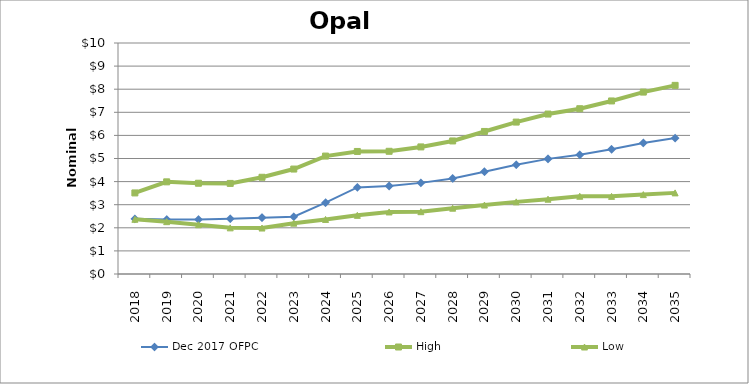
| Category | Dec 2017 OFPC | High | Low |
|---|---|---|---|
| 2018.0 | 2.387 | 3.51 | 2.367 |
| 2019.0 | 2.358 | 3.989 | 2.266 |
| 2020.0 | 2.358 | 3.929 | 2.133 |
| 2021.0 | 2.391 | 3.921 | 1.998 |
| 2022.0 | 2.439 | 4.187 | 1.991 |
| 2023.0 | 2.477 | 4.543 | 2.199 |
| 2024.0 | 3.086 | 5.105 | 2.362 |
| 2025.0 | 3.749 | 5.305 | 2.539 |
| 2026.0 | 3.809 | 5.312 | 2.686 |
| 2027.0 | 3.945 | 5.501 | 2.698 |
| 2028.0 | 4.134 | 5.76 | 2.849 |
| 2029.0 | 4.429 | 6.17 | 2.985 |
| 2030.0 | 4.73 | 6.576 | 3.123 |
| 2031.0 | 4.984 | 6.924 | 3.239 |
| 2032.0 | 5.159 | 7.156 | 3.366 |
| 2033.0 | 5.398 | 7.491 | 3.361 |
| 2034.0 | 5.674 | 7.875 | 3.437 |
| 2035.0 | 5.885 | 8.166 | 3.512 |